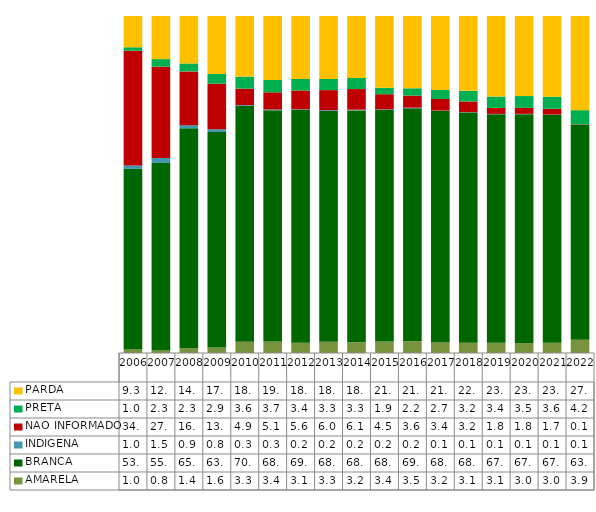
| Category | AMARELA | BRANCA | INDIGENA | NAO INFORMADO | PRETA | PARDA |
|---|---|---|---|---|---|---|
| 2006.0 | 0.01 | 0.536 | 0.01 | 0.34 | 0.01 | 0.093 |
| 2007.0 | 0.008 | 0.556 | 0.015 | 0.271 | 0.023 | 0.128 |
| 2008.0 | 0.014 | 0.653 | 0.009 | 0.16 | 0.023 | 0.141 |
| 2009.0 | 0.016 | 0.639 | 0.008 | 0.135 | 0.029 | 0.172 |
| 2010.0 | 0.033 | 0.7 | 0.003 | 0.049 | 0.036 | 0.18 |
| 2011.0 | 0.034 | 0.686 | 0.003 | 0.051 | 0.037 | 0.19 |
| 2012.0 | 0.031 | 0.69 | 0.002 | 0.056 | 0.034 | 0.187 |
| 2013.0 | 0.033 | 0.685 | 0.002 | 0.06 | 0.033 | 0.187 |
| 2014.0 | 0.032 | 0.688 | 0.002 | 0.061 | 0.033 | 0.184 |
| 2015.0 | 0.034 | 0.687 | 0.002 | 0.045 | 0.019 | 0.213 |
| 2016.0 | 0.035 | 0.691 | 0.002 | 0.036 | 0.022 | 0.215 |
| 2017.0 | 0.032 | 0.686 | 0.001 | 0.034 | 0.027 | 0.219 |
| 2018.0 | 0.031 | 0.683 | 0.001 | 0.032 | 0.032 | 0.222 |
| 2019.0 | 0.031 | 0.678 | 0.001 | 0.018 | 0.034 | 0.239 |
| 2020.0 | 0.03 | 0.679 | 0.001 | 0.018 | 0.035 | 0.238 |
| 2021.0 | 0.03 | 0.676 | 0.001 | 0.017 | 0.036 | 0.239 |
| 2022.0 | 0.039 | 0.638 | 0.001 | 0.001 | 0.042 | 0.279 |